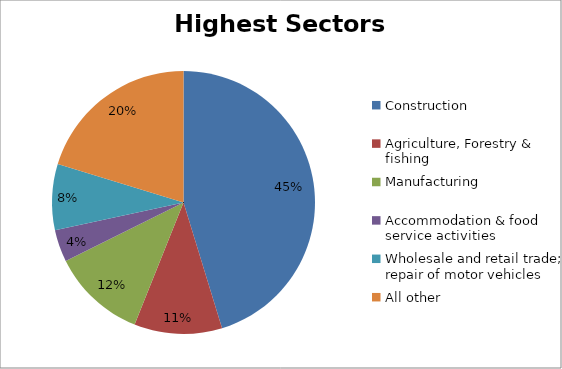
| Category | Sectors with highest totals | Percentage |
|---|---|---|
| Construction | 20339 | 0.453 |
| Agriculture, Forestry & fishing | 4854 | 0.108 |
| Manufacturing | 5211 | 0.116 |
| Accommodation & food service activities | 1775 | 0.04 |
| Wholesale and retail trade; repair of motor vehicles  | 3645 | 0.081 |
| All other | 9111 | 0.203 |